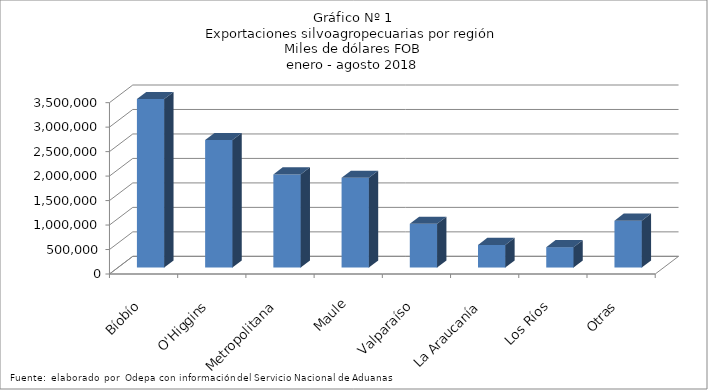
| Category | Series 0 |
|---|---|
| Bíobío | 3441690.888 |
| O'Higgins | 2603826.425 |
| Metropolitana | 1901773.227 |
| Maule | 1831938.447 |
| Valparaíso | 892692.619 |
| La Araucanía | 461542.734 |
| Los Ríos | 416465.592 |
| Otras | 957481.031 |